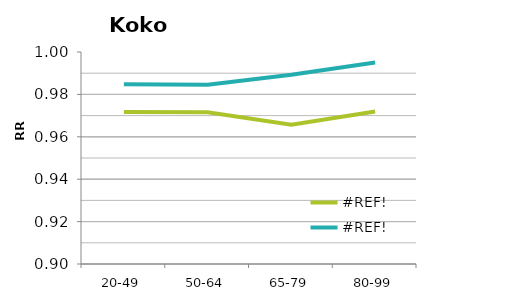
| Category | #REF! |
|---|---|
| 20-49 | 0.985 |
| 50-64 | 0.985 |
| 65-79 | 0.989 |
| 80-99 | 0.995 |